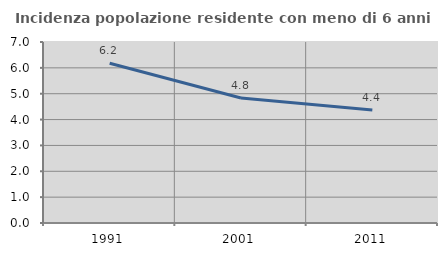
| Category | Incidenza popolazione residente con meno di 6 anni |
|---|---|
| 1991.0 | 6.178 |
| 2001.0 | 4.832 |
| 2011.0 | 4.372 |